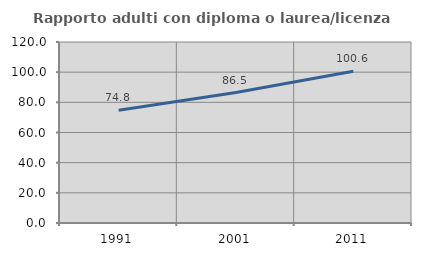
| Category | Rapporto adulti con diploma o laurea/licenza media  |
|---|---|
| 1991.0 | 74.803 |
| 2001.0 | 86.503 |
| 2011.0 | 100.592 |